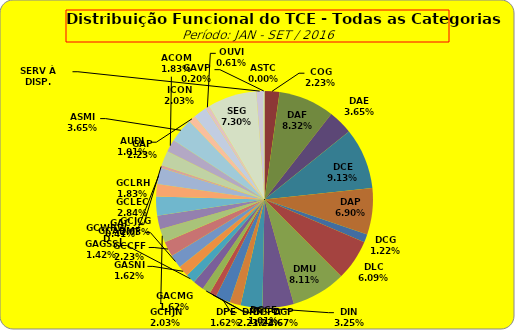
| Category | ASTC |
|---|---|
| ASTC | 0 |
| COG | 11 |
| DAF | 41 |
| DAE | 18 |
| DCE | 45 |
| DAP | 34 |
| DCG | 6 |
| DLC | 30 |
| DMU | 40 |
| DGP | 23 |
| DIN | 16 |
| DPE | 8 |
| DRR | 11 |
| DGCE | 5 |
| DGPA | 6 |
| GACMG | 8 |
| GAGSS | 7 |
| GASNI | 8 |
| GCADMFJ | 10 |
| GCCFF | 11 |
| GCHJN | 10 |
| GCJCG | 10 |
| GCLEC | 14 |
| GCLRH | 9 |
| GCWRWD | 12 |
| GAC | 2 |
| GAP | 11 |
| ACOM | 9 |
| ASMI | 18 |
| AUDI | 5 |
| ICON | 10 |
| OUVI | 3 |
| SEG | 36 |
| SERV À DISP. | 5 |
| GAVP | 1 |